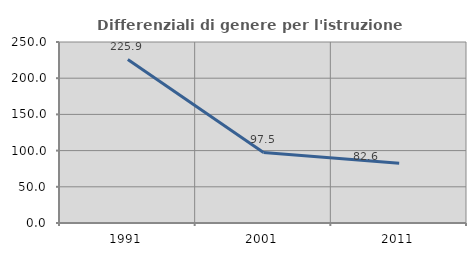
| Category | Differenziali di genere per l'istruzione superiore |
|---|---|
| 1991.0 | 225.866 |
| 2001.0 | 97.483 |
| 2011.0 | 82.576 |